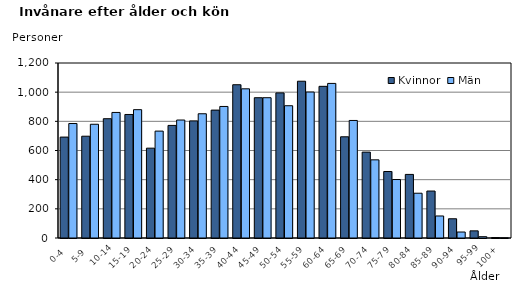
| Category | Kvinnor | Män |
|---|---|---|
|   0-4  | 692 | 785 |
|   5-9  | 698 | 780 |
| 10-14 | 818 | 861 |
| 15-19  | 847 | 880 |
| 20-24  | 616 | 733 |
| 25-29  | 772 | 809 |
| 30-34  | 803 | 852 |
| 35-39  | 877 | 902 |
| 40-44  | 1051 | 1023 |
| 45-49  | 962 | 962 |
| 50-54  | 995 | 907 |
| 55-59  | 1075 | 1001 |
| 60-64  | 1040 | 1060 |
| 65-69  | 694 | 806 |
| 70-74  | 589 | 536 |
| 75-79  | 456 | 401 |
| 80-84  | 436 | 307 |
| 85-89  | 322 | 151 |
| 90-94  | 132 | 41 |
| 95-99 | 49 | 9 |
| 100+ | 3 | 1 |